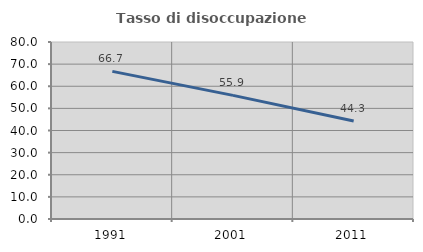
| Category | Tasso di disoccupazione giovanile  |
|---|---|
| 1991.0 | 66.727 |
| 2001.0 | 55.864 |
| 2011.0 | 44.262 |